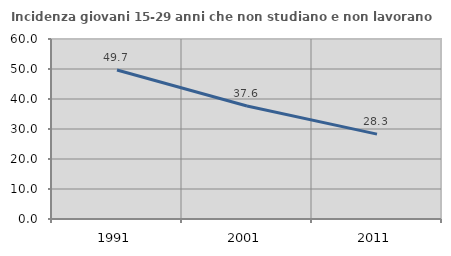
| Category | Incidenza giovani 15-29 anni che non studiano e non lavorano  |
|---|---|
| 1991.0 | 49.677 |
| 2001.0 | 37.648 |
| 2011.0 | 28.291 |